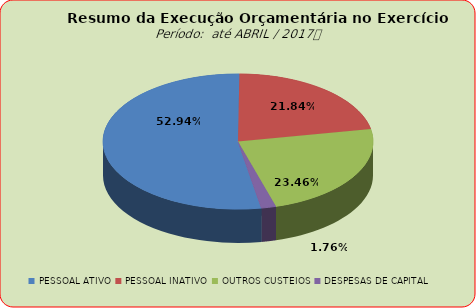
| Category | Series 0 |
|---|---|
| PESSOAL ATIVO | 49242167.66 |
| PESSOAL INATIVO | 20310330.71 |
| OUTROS CUSTEIOS | 21822240.12 |
| DESPESAS DE CAPITAL | 1633021.63 |